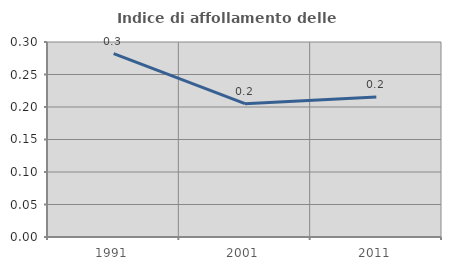
| Category | Indice di affollamento delle abitazioni  |
|---|---|
| 1991.0 | 0.282 |
| 2001.0 | 0.205 |
| 2011.0 | 0.215 |